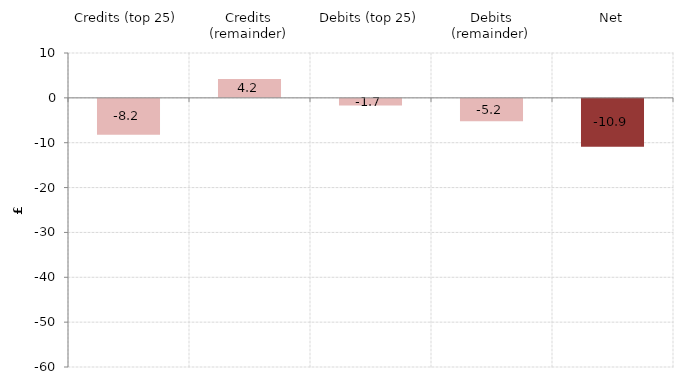
| Category | Series 1 |
|---|---|
| Credits (top 25) | -8.2 |
| Credits (remainder) | 4.2 |
| Debits (top 25) | -1.7 |
| Debits (remainder) | -5.2 |
| Net | -10.9 |